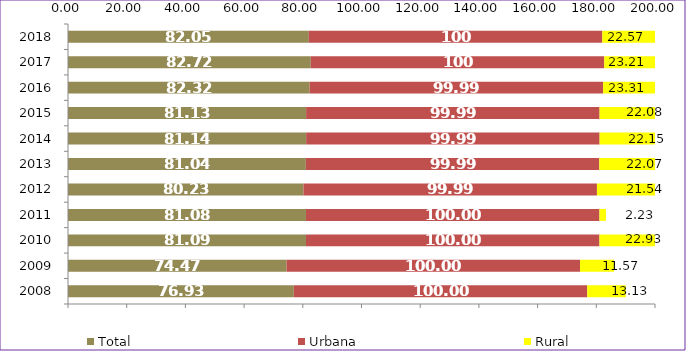
| Category | Total | Urbana | Rural |
|---|---|---|---|
| 2008.0 | 76.93 | 100 | 13.13 |
| 2009.0 | 74.47 | 100 | 11.57 |
| 2010.0 | 81.09 | 100 | 22.93 |
| 2011.0 | 81.08 | 100 | 2.23 |
| 2012.0 | 80.23 | 99.99 | 21.54 |
| 2013.0 | 81.04 | 99.99 | 22.07 |
| 2014.0 | 81.14 | 99.99 | 22.15 |
| 2015.0 | 81.13 | 99.99 | 22.08 |
| 2016.0 | 82.32 | 99.99 | 23.31 |
| 2017.0 | 82.72 | 100 | 23.21 |
| 2018.0 | 82.05 | 100 | 22.57 |